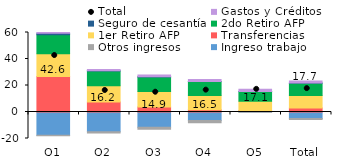
| Category | Ingreso trabajo | Otros ingresos | Transferencias | 1er Retiro AFP | 2do Retiro AFP | Seguro de cesantía | Gastos y Créditos |
|---|---|---|---|---|---|---|---|
| Q1 | -17.455 | -0.485 | 26.846 | 17.135 | 14.227 | 1.203 | 1.151 |
| Q2 | -14.875 | -0.935 | 7.603 | 12.296 | 10.952 | 0.318 | 0.88 |
| Q3 | -11.545 | -1.393 | 3.735 | 11.74 | 10.987 | 0.155 | 1.255 |
| Q4 | -6.399 | -1.649 | 1.674 | 10.813 | 10.449 | 0.061 | 1.548 |
| Q5 | 0.608 | -0.143 | 0.427 | 7.071 | 7.42 | 0.007 | 1.701 |
| Total | -4.942 | -0.725 | 3.026 | 9.474 | 9.205 | 0.123 | 1.497 |